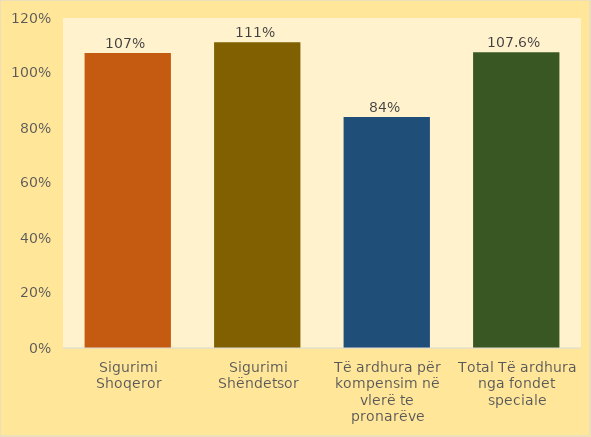
| Category | Norma e Realizimit |
|---|---|
| Sigurimi Shoqeror | 1.073 |
| Sigurimi Shëndetsor | 1.112 |
| Të ardhura për kompensim në vlerë te pronarëve | 0.84 |
| Total Të ardhura nga fondet speciale | 1.076 |